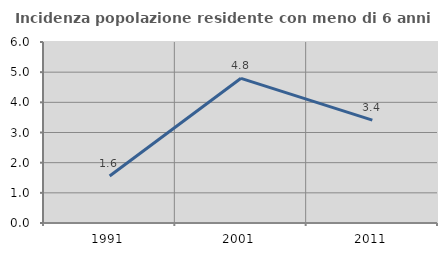
| Category | Incidenza popolazione residente con meno di 6 anni |
|---|---|
| 1991.0 | 1.558 |
| 2001.0 | 4.796 |
| 2011.0 | 3.412 |